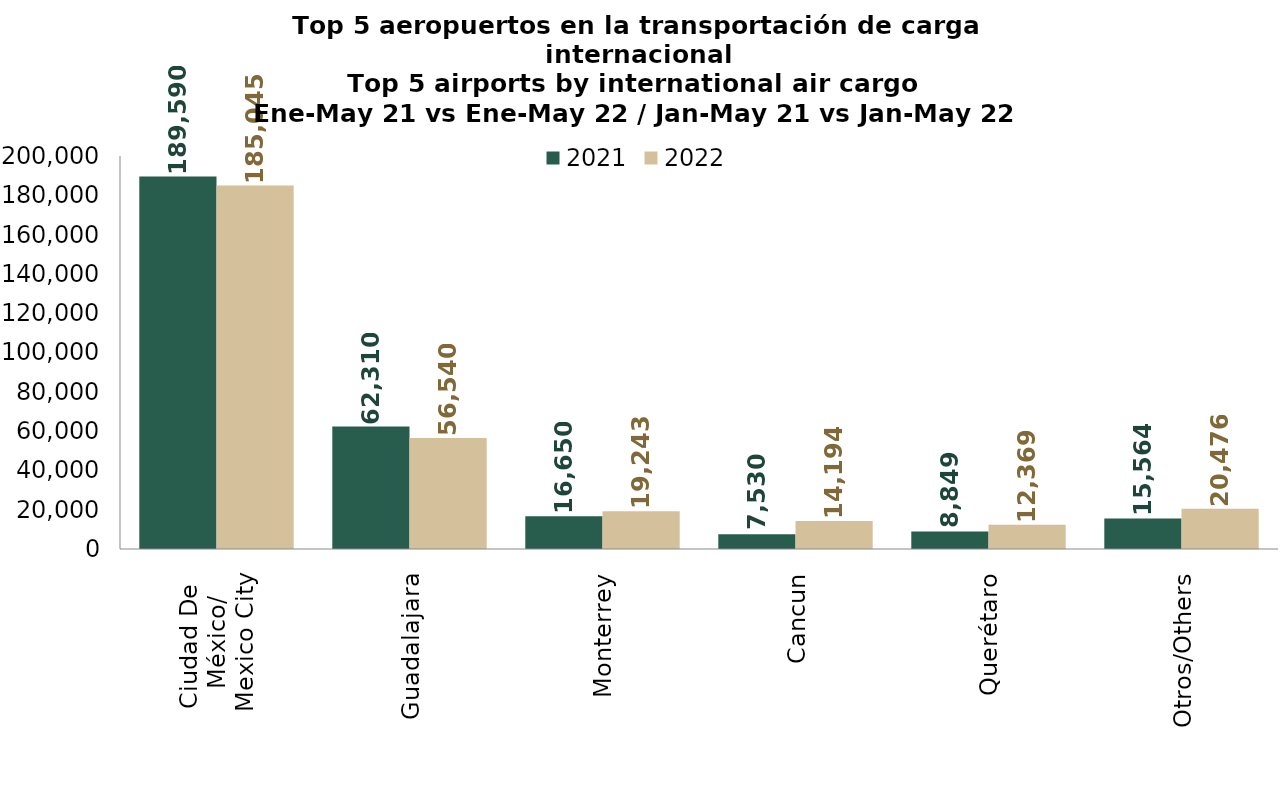
| Category | 2021 | 2022 |
|---|---|---|
| Ciudad De 
México/
Mexico City | 189589.58 | 185045.401 |
| Guadalajara | 62309.775 | 56540.215 |
| Monterrey | 16649.532 | 19242.977 |
| Cancun | 7529.688 | 14194.411 |
| Querétaro | 8848.857 | 12368.836 |
| Otros/Others | 15564.074 | 20475.882 |